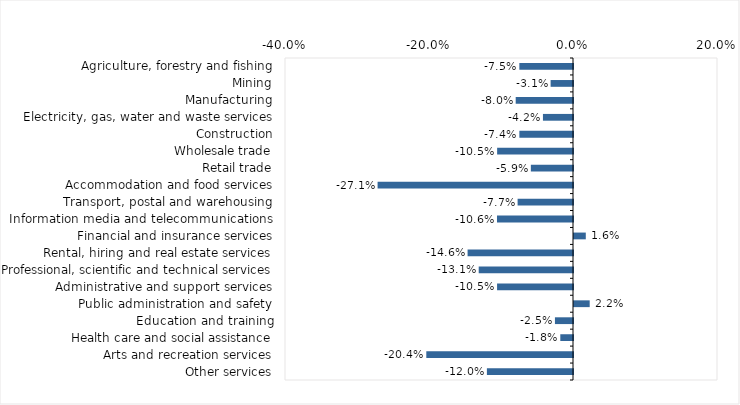
| Category | This week |
|---|---|
| Agriculture, forestry and fishing | -0.075 |
| Mining | -0.031 |
| Manufacturing | -0.08 |
| Electricity, gas, water and waste services | -0.042 |
| Construction | -0.074 |
| Wholesale trade | -0.105 |
| Retail trade | -0.059 |
| Accommodation and food services | -0.271 |
| Transport, postal and warehousing | -0.077 |
| Information media and telecommunications | -0.106 |
| Financial and insurance services | 0.016 |
| Rental, hiring and real estate services | -0.146 |
| Professional, scientific and technical services | -0.131 |
| Administrative and support services | -0.105 |
| Public administration and safety | 0.022 |
| Education and training | -0.025 |
| Health care and social assistance | -0.018 |
| Arts and recreation services | -0.204 |
| Other services | -0.12 |